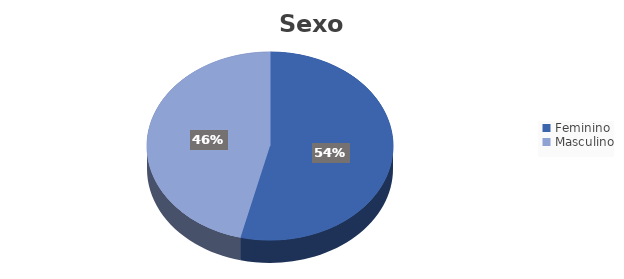
| Category | Series 0 |
|---|---|
| Feminino | 0.538 |
| Masculino | 0.462 |